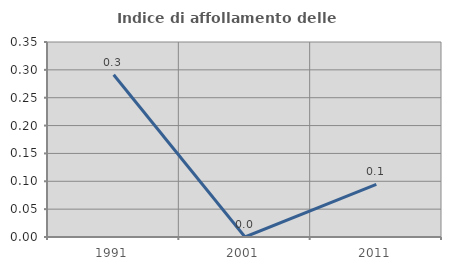
| Category | Indice di affollamento delle abitazioni  |
|---|---|
| 1991.0 | 0.291 |
| 2001.0 | 0 |
| 2011.0 | 0.094 |